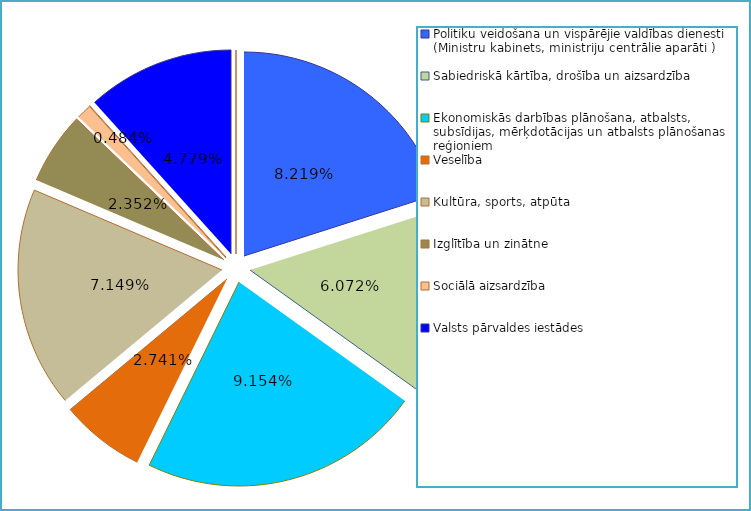
| Category | Series 0 |
|---|---|
| Politiku veidošana un vispārējie valdības dienesti (Ministru kabinets, ministriju centrālie aparāti ) | 0.082 |
| Sabiedriskā kārtība, drošība un aizsardzība | 0.061 |
| Ekonomiskās darbības plānošana, atbalsts, subsīdijas, mērķdotācijas un atbalsts plānošanas reģioniem | 0.092 |
| Veselība | 0.027 |
| Kultūra, sports, atpūta | 0.071 |
| Izglītība un zinātne | 0.024 |
| Sociālā aizsardzība | 0.005 |
| Valsts parāda vadība, iemaksas ES un starptautiskajās institūcijās | 0 |
| Valsts pārvaldes iestādes | 0.048 |
| Ar ārvalstu finanšu palīdzību saistīti izdevumi | 0 |
| Neatkarīgās iestādes | 0 |